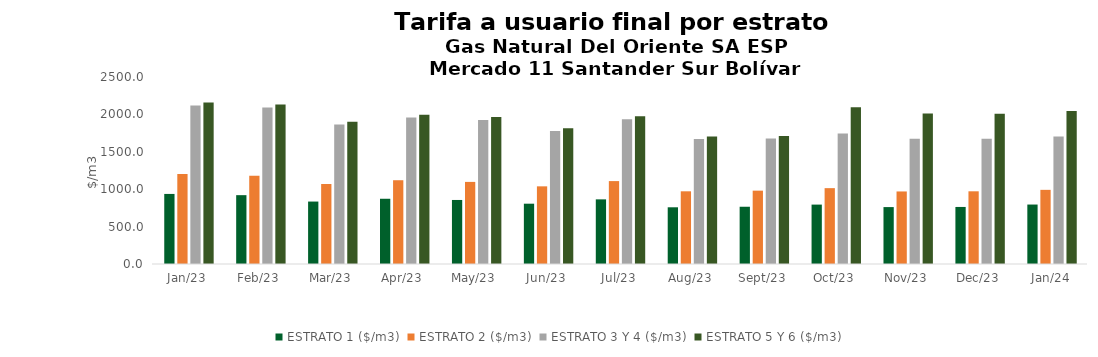
| Category | ESTRATO 1 ($/m3) | ESTRATO 2 ($/m3) | ESTRATO 3 Y 4 ($/m3) | ESTRATO 5 Y 6 ($/m3) |
|---|---|---|---|---|
| 2023-01-01 | 936.76 | 1204.6 | 2117.59 | 2159.942 |
| 2023-02-01 | 920.36 | 1179.08 | 2091.73 | 2133.565 |
| 2023-03-01 | 834.84 | 1069.75 | 1864.96 | 1902.259 |
| 2023-04-01 | 872.23 | 1119.98 | 1956.98 | 1996.12 |
| 2023-05-01 | 856.04 | 1097.58 | 1926.46 | 1964.989 |
| 2023-06-01 | 806.28 | 1038.3 | 1778.05 | 1813.611 |
| 2023-07-01 | 864.11 | 1108.42 | 1935.47 | 1974.179 |
| 2023-08-01 | 758.17 | 971.8 | 1672.03 | 1705.471 |
| 2023-09-01 | 765.41 | 980.53 | 1679.03 | 1712.611 |
| 2023-10-01 | 794.12 | 1014.06 | 1746.12 | 2095.344 |
| 2023-11-01 | 760.84 | 969.81 | 1675.45 | 2010.54 |
| 2023-12-01 | 762.7 | 971.9 | 1675 | 2010 |
| 2024-01-01 | 794.89 | 991.4 | 1705.82 | 2046.984 |